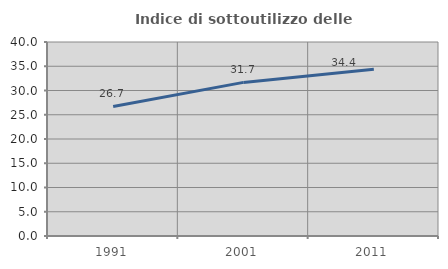
| Category | Indice di sottoutilizzo delle abitazioni  |
|---|---|
| 1991.0 | 26.713 |
| 2001.0 | 31.671 |
| 2011.0 | 34.401 |